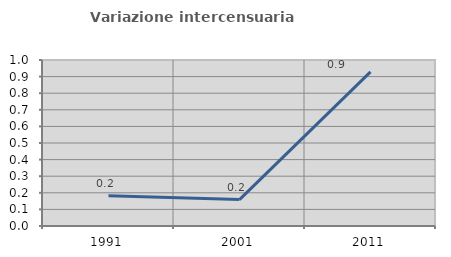
| Category | Variazione intercensuaria annua |
|---|---|
| 1991.0 | 0.182 |
| 2001.0 | 0.159 |
| 2011.0 | 0.928 |